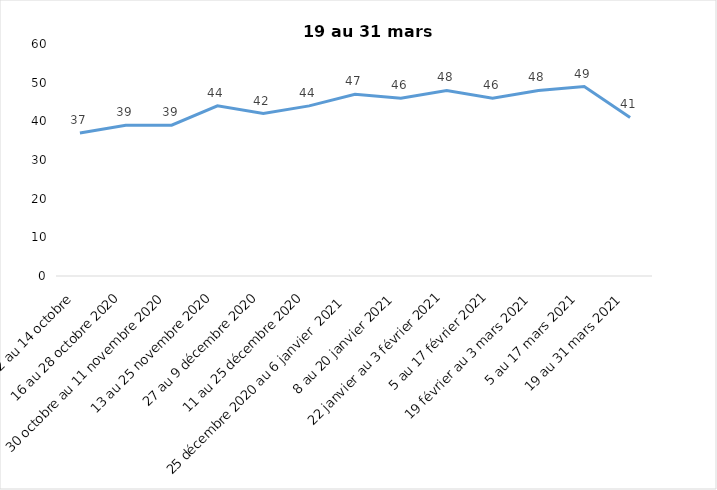
| Category | Toujours aux trois mesures |
|---|---|
| 2 au 14 octobre  | 37 |
| 16 au 28 octobre 2020 | 39 |
| 30 octobre au 11 novembre 2020 | 39 |
| 13 au 25 novembre 2020 | 44 |
| 27 au 9 décembre 2020 | 42 |
| 11 au 25 décembre 2020 | 44 |
| 25 décembre 2020 au 6 janvier  2021 | 47 |
| 8 au 20 janvier 2021 | 46 |
| 22 janvier au 3 février 2021 | 48 |
| 5 au 17 février 2021 | 46 |
| 19 février au 3 mars 2021 | 48 |
| 5 au 17 mars 2021 | 49 |
| 19 au 31 mars 2021 | 41 |